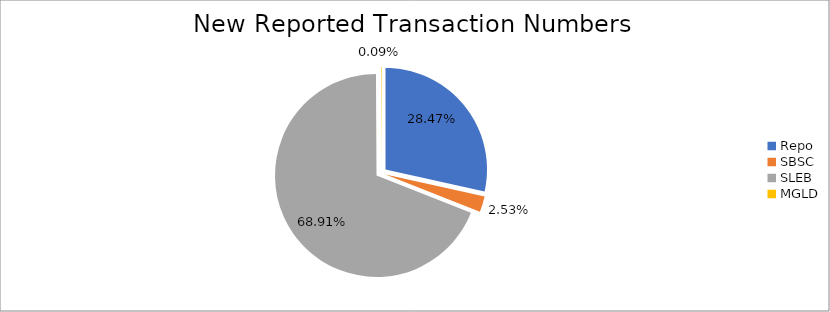
| Category | Series 0 |
|---|---|
| Repo | 314981 |
| SBSC | 28002 |
| SLEB | 762469 |
| MGLD | 947 |